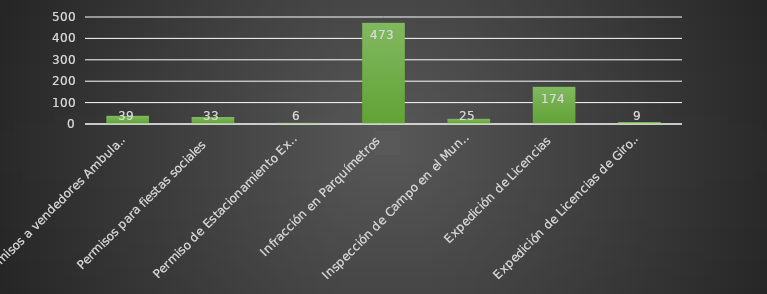
| Category | Series 5 |
|---|---|
| Permisos a vendedores Ambulantes | 39 |
| Permisos para fiestas sociales | 33 |
| Permiso de Estacionamiento Exclusivo para Discapacitados | 6 |
| Infracción en Parquímetros | 473 |
| Inspección de Campo en el Municipio | 25 |
| Expedición de Licencias | 174 |
| Expedición de Licencias de Giros Restringidos | 9 |